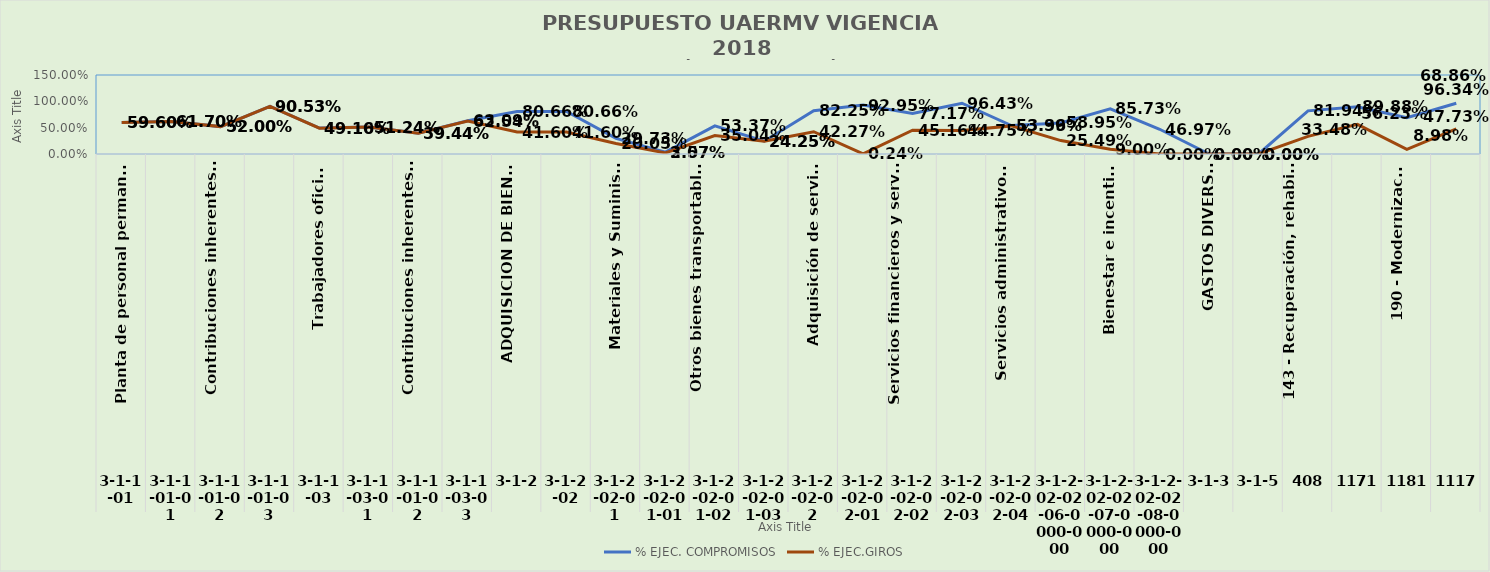
| Category | % EJEC. COMPROMISOS | % EJEC.GIROS |
|---|---|---|
| 0 | 0.596 | 0.596 |
| 1 | 0.617 | 0.617 |
| 2 | 0.52 | 0.52 |
| 3 | 0.905 | 0.905 |
| 4 | 0.492 | 0.491 |
| 5 | 0.512 | 0.512 |
| 6 | 0.394 | 0.394 |
| 7 | 0.631 | 0.625 |
| 8 | 0.807 | 0.416 |
| 9 | 0.807 | 0.416 |
| 10 | 0.297 | 0.201 |
| 11 | 0.036 | 0.021 |
| 12 | 0.534 | 0.35 |
| 13 | 0.243 | 0.243 |
| 14 | 0.822 | 0.423 |
| 15 | 0.929 | 0.002 |
| 16 | 0.772 | 0.452 |
| 17 | 0.964 | 0.447 |
| 18 | 0.54 | 0.534 |
| 19 | 0.59 | 0.255 |
| 20 | 0.857 | 0.09 |
| 21 | 0.47 | 0 |
| 22 | 0 | 0 |
| 23 | 0 | 0 |
| 24 | 0.819 | 0.335 |
| 25 | 0.899 | 0.562 |
| 26 | 0.689 | 0.09 |
| 27 | 0.963 | 0.477 |